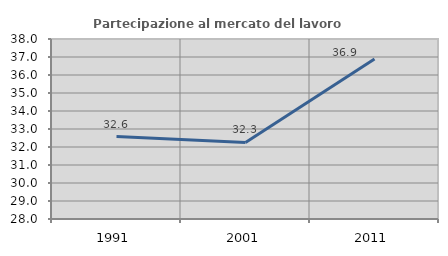
| Category | Partecipazione al mercato del lavoro  femminile |
|---|---|
| 1991.0 | 32.583 |
| 2001.0 | 32.254 |
| 2011.0 | 36.888 |